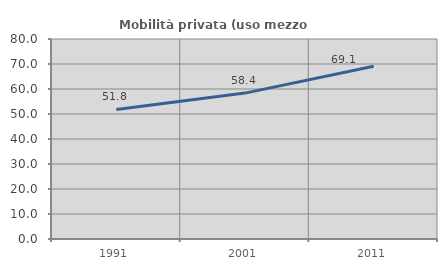
| Category | Mobilità privata (uso mezzo privato) |
|---|---|
| 1991.0 | 51.812 |
| 2001.0 | 58.362 |
| 2011.0 | 69.086 |